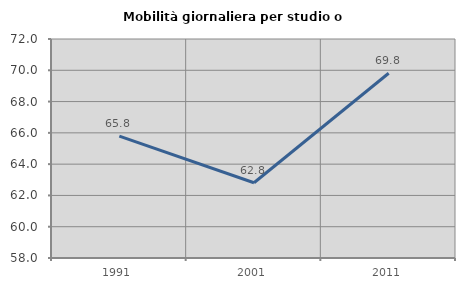
| Category | Mobilità giornaliera per studio o lavoro |
|---|---|
| 1991.0 | 65.791 |
| 2001.0 | 62.808 |
| 2011.0 | 69.808 |